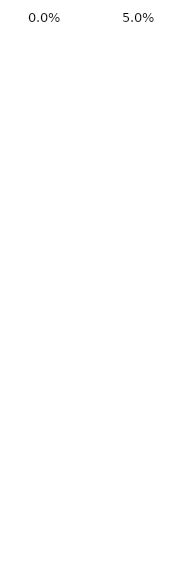
| Category | Series 0 | Series 1 |
|---|---|---|
|  | 0.04 | 0 |
|  | 0.04 | 0 |
|  | 0.04 | 0 |
|  | 0.04 | 0 |
|  | 0.04 | 0 |
|                                   | 0.04 | 0 |